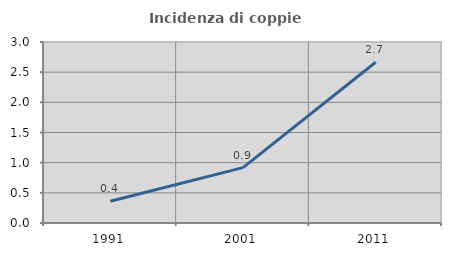
| Category | Incidenza di coppie miste |
|---|---|
| 1991.0 | 0.36 |
| 2001.0 | 0.917 |
| 2011.0 | 2.664 |